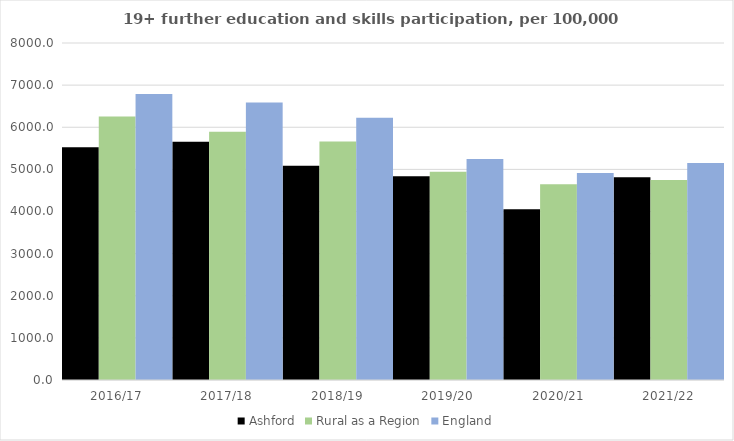
| Category | Ashford | Rural as a Region | England |
|---|---|---|---|
| 2016/17 | 5528 | 6253.401 | 6788 |
| 2017/18 | 5655 | 5892.029 | 6588 |
| 2018/19 | 5088 | 5661.873 | 6227 |
| 2019/20 | 4837 | 4943.801 | 5244 |
| 2020/21 | 4054 | 4646.727 | 4913 |
| 2021/22 | 4814 | 4747.049 | 5151 |